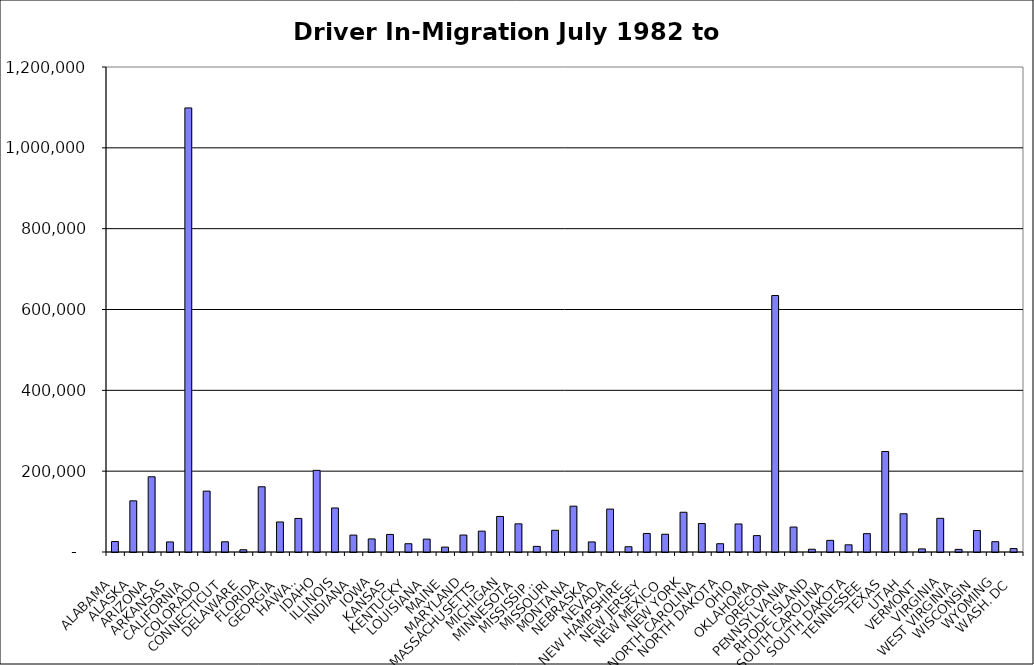
| Category | Series 0 |
|---|---|
| ALABAMA | 25887.5 |
| ALASKA | 126565.5 |
| ARIZONA | 186120 |
| ARKANSAS | 24934.5 |
| CALIFORNIA | 1098714.5 |
| COLORADO | 150649 |
| CONNECTICUT | 25280 |
| DELAWARE | 5542.5 |
| FLORIDA | 161375 |
| GEORGIA | 74286 |
| HAWAII | 83022.5 |
| IDAHO | 202007.5 |
| ILLINOIS | 108908.5 |
| INDIANA | 41792 |
| IOWA | 32352.5 |
| KANSAS | 43467.5 |
| KENTUCKY | 20470 |
| LOUISIANA | 31867.5 |
| MAINE | 12098.5 |
| MARYLAND | 41972 |
| MASSACHUSETTS | 51579 |
| MICHIGAN | 87925 |
| MINNESOTA | 69634.5 |
| MISSISSIPPI | 13889 |
| MISSOURI | 53744 |
| MONTANA | 113419 |
| NEBRASKA | 24924.5 |
| NEVADA | 106168 |
| NEW HAMPSHIRE | 12992.5 |
| NEW JERSEY | 45854 |
| NEW MEXICO | 43983 |
| NEW YORK | 98336 |
| NORTH CAROLINA | 70379.5 |
| NORTH DAKOTA | 20466.5 |
| OHIO | 69347.5 |
| OKLAHOMA | 40517 |
| OREGON | 634576 |
| PENNSYLVANIA | 61749.5 |
| RHODE ISLAND | 6850 |
| SOUTH CAROLINA | 28753.5 |
| SOUTH DAKOTA | 17748.5 |
| TENNESSEE | 45455.5 |
| TEXAS | 248546 |
| UTAH | 94564.5 |
| VERMONT | 7685 |
| VIRGINIA | 83334 |
| WEST VIRGINIA | 6518.5 |
| WISCONSIN | 53192.5 |
| WYOMING | 25486 |
| WASH. DC | 8487 |